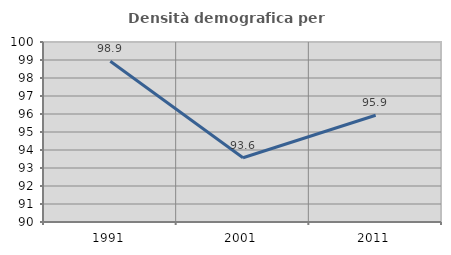
| Category | Densità demografica |
|---|---|
| 1991.0 | 98.926 |
| 2001.0 | 93.568 |
| 2011.0 | 95.928 |